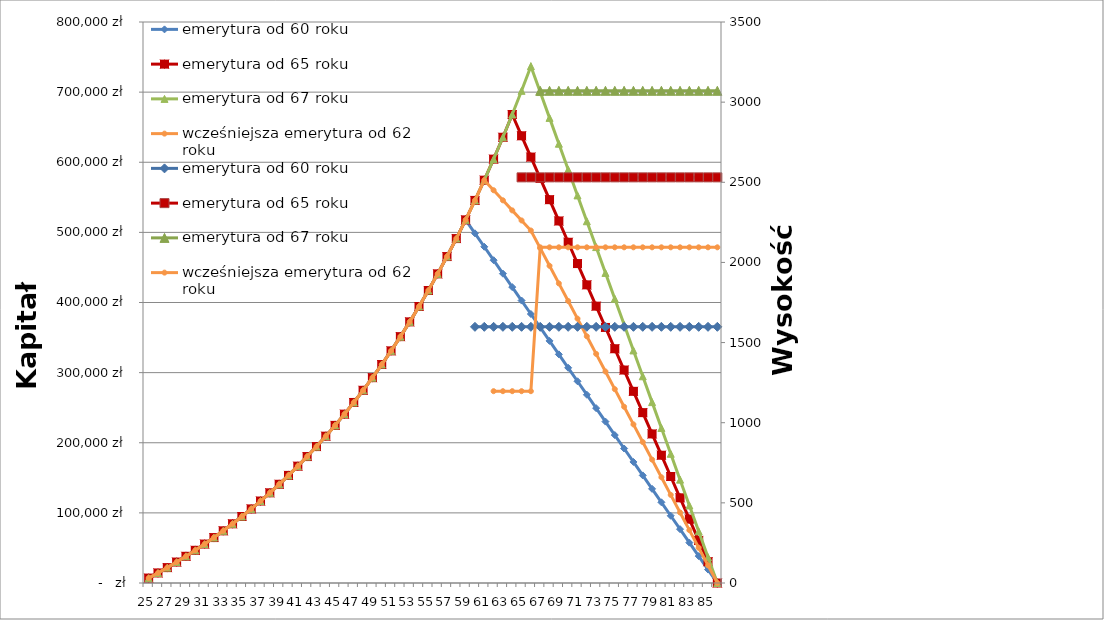
| Category | emerytura od 60 roku | emerytura od 65 roku | emerytura od 67 roku | wcześniejsza emerytura od 62 roku |
|---|---|---|---|---|
| 25.0 | 7030.8 | 7030.8 | 7030.8 | 7030.8 |
| 26.0 | 14342.832 | 14342.832 | 14342.832 | 14342.832 |
| 27.0 | 21947.345 | 21947.345 | 21947.345 | 21947.345 |
| 28.0 | 29856.039 | 29856.039 | 29856.039 | 29856.039 |
| 29.0 | 38081.081 | 38081.081 | 38081.081 | 38081.081 |
| 30.0 | 46635.124 | 46635.124 | 46635.124 | 46635.124 |
| 31.0 | 55531.329 | 55531.329 | 55531.329 | 55531.329 |
| 32.0 | 64783.382 | 64783.382 | 64783.382 | 64783.382 |
| 33.0 | 74405.517 | 74405.517 | 74405.517 | 74405.517 |
| 34.0 | 84412.538 | 84412.538 | 84412.538 | 84412.538 |
| 35.0 | 94819.839 | 94819.839 | 94819.839 | 94819.839 |
| 36.0 | 105643.433 | 105643.433 | 105643.433 | 105643.433 |
| 37.0 | 116899.97 | 116899.97 | 116899.97 | 116899.97 |
| 38.0 | 128606.769 | 128606.769 | 128606.769 | 128606.769 |
| 39.0 | 140781.84 | 140781.84 | 140781.84 | 140781.84 |
| 40.0 | 153443.914 | 153443.914 | 153443.914 | 153443.914 |
| 41.0 | 166612.47 | 166612.47 | 166612.47 | 166612.47 |
| 42.0 | 180307.769 | 180307.769 | 180307.769 | 180307.769 |
| 43.0 | 194550.88 | 194550.88 | 194550.88 | 194550.88 |
| 44.0 | 209363.715 | 209363.715 | 209363.715 | 209363.715 |
| 45.0 | 224769.063 | 224769.063 | 224769.063 | 224769.063 |
| 46.0 | 240790.626 | 240790.626 | 240790.626 | 240790.626 |
| 47.0 | 257453.051 | 257453.051 | 257453.051 | 257453.051 |
| 48.0 | 274781.973 | 274781.973 | 274781.973 | 274781.973 |
| 49.0 | 292804.052 | 292804.052 | 292804.052 | 292804.052 |
| 50.0 | 311547.014 | 311547.014 | 311547.014 | 311547.014 |
| 51.0 | 331039.695 | 331039.695 | 331039.695 | 331039.695 |
| 52.0 | 351312.082 | 351312.082 | 351312.082 | 351312.082 |
| 53.0 | 372395.366 | 372395.366 | 372395.366 | 372395.366 |
| 54.0 | 394321.98 | 394321.98 | 394321.98 | 394321.98 |
| 55.0 | 417125.66 | 417125.66 | 417125.66 | 417125.66 |
| 56.0 | 440841.486 | 440841.486 | 440841.486 | 440841.486 |
| 57.0 | 465505.945 | 465505.945 | 465505.945 | 465505.945 |
| 58.0 | 491156.983 | 491156.983 | 491156.983 | 491156.983 |
| 59.0 | 517834.063 | 517834.063 | 517834.063 | 517834.063 |
| 60.0 | 498655.023 | 545578.225 | 545578.225 | 545578.225 |
| 61.0 | 479475.984 | 574432.154 | 574432.154 | 574432.154 |
| 62.0 | 460296.944 | 604440.24 | 604440.24 | 560071.35 |
| 63.0 | 441117.905 | 635648.65 | 635648.65 | 545710.546 |
| 64.0 | 421938.866 | 668105.396 | 668105.396 | 531349.742 |
| 65.0 | 402759.826 | 637736.969 | 701860.412 | 516988.939 |
| 66.0 | 383580.787 | 607368.542 | 736965.628 | 502628.135 |
| 67.0 | 364401.748 | 577000.115 | 700117.347 | 477496.728 |
| 68.0 | 345222.708 | 546631.687 | 663269.065 | 452365.321 |
| 69.0 | 326043.669 | 516263.26 | 626420.784 | 427233.915 |
| 70.0 | 306864.63 | 485894.833 | 589572.502 | 402102.508 |
| 71.0 | 287685.59 | 455526.406 | 552724.221 | 376971.101 |
| 72.0 | 268506.551 | 425157.979 | 515875.94 | 351839.694 |
| 73.0 | 249327.512 | 394789.552 | 479027.658 | 326708.288 |
| 74.0 | 230148.472 | 364421.125 | 442179.377 | 301576.881 |
| 75.0 | 210969.433 | 334052.698 | 405331.095 | 276445.474 |
| 76.0 | 191790.394 | 303684.271 | 368482.814 | 251314.067 |
| 77.0 | 172611.354 | 273315.844 | 331634.533 | 226182.661 |
| 78.0 | 153432.315 | 242947.417 | 294786.251 | 201051.254 |
| 79.0 | 134253.275 | 212578.99 | 257937.97 | 175919.847 |
| 80.0 | 115074.236 | 182210.562 | 221089.688 | 150788.44 |
| 81.0 | 95895.197 | 151842.135 | 184241.407 | 125657.034 |
| 82.0 | 76716.157 | 121473.708 | 147393.126 | 100525.627 |
| 83.0 | 57537.118 | 91105.281 | 110544.844 | 75394.22 |
| 84.0 | 38358.079 | 60736.854 | 73696.563 | 50262.813 |
| 85.0 | 19179.039 | 30368.427 | 36848.281 | 25131.407 |
| 86.0 | 0 | 0 | 0 | 0 |